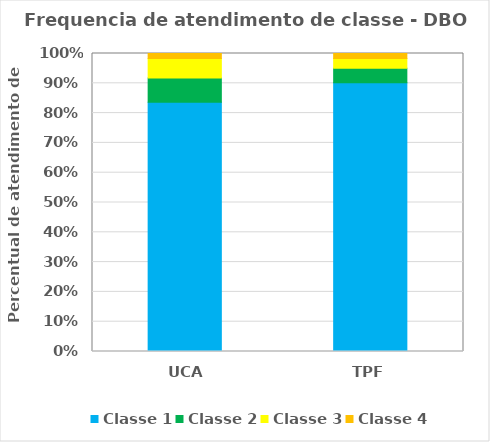
| Category | Classe 1 | Classe 2 | Classe 3 | Classe 4 |
|---|---|---|---|---|
| UCA | 0.836 | 0.082 | 0.066 | 0.016 |
| TPF | 0.902 | 0.049 | 0.033 | 0.016 |